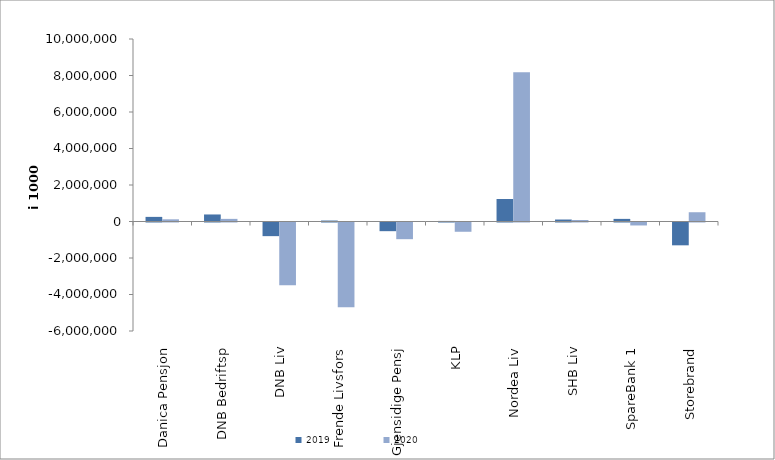
| Category | 2019 | 2020 |
|---|---|---|
| Danica Pensjon | 252935.324 | 119419.5 |
| DNB Bedriftsp | 385283 | 143940 |
| DNB Liv | -747449 | -3431819 |
| Frende Livsfors | 52602 | -4640062 |
| Gjensidige Pensj | -475395 | -914343 |
| KLP | 31148.104 | -507465.172 |
| Nordea Liv | 1232764.595 | 8176088.13 |
| SHB Liv | 108424.593 | 82451.076 |
| SpareBank 1 | 143228.919 | -162317.008 |
| Storebrand | -1250440.145 | 507642.658 |